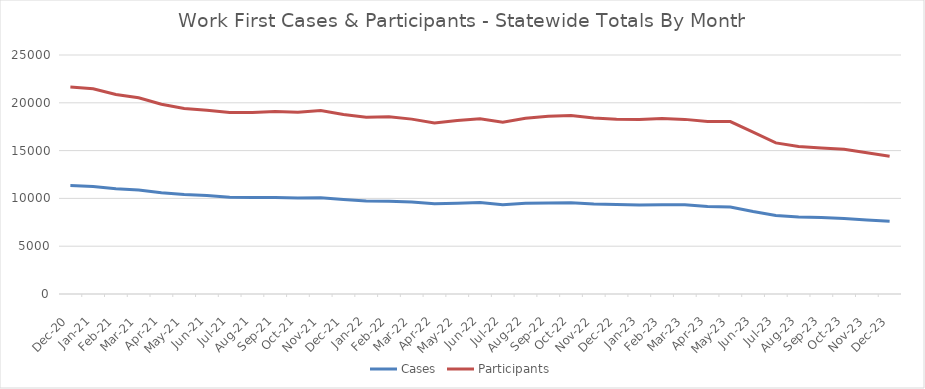
| Category | Cases | Participants |
|---|---|---|
| 2023-12-23 | 7598 | 14413 |
| 2023-11-23 | 7733 | 14770 |
| 2023-10-23 | 7909 | 15129 |
| 2023-09-23 | 7993 | 15261 |
| 2023-08-23 | 8048 | 15431 |
| 2023-07-23 | 8201 | 15804 |
| 2023-06-23 | 8626 | 16926 |
| 2023-05-23 | 9109 | 18037 |
| 2023-04-23 | 9158 | 18032 |
| 2023-03-23 | 9330 | 18266 |
| 2023-02-01 | 9348 | 18367 |
| 2023-01-01 | 9307 | 18258 |
| 2022-12-01 | 9357 | 18283 |
| 2022-11-22 | 9423 | 18412 |
| 2022-10-22 | 9547 | 18673 |
| 2022-09-22 | 9528 | 18586 |
| 2022-08-22 | 9505 | 18379 |
| 2022-07-22 | 9349 | 17973 |
| 2022-06-22 | 9561 | 18334 |
| 2022-05-22 | 9493 | 18139 |
| 2022-04-22 | 9434 | 17898 |
| 2022-03-22 | 9625 | 18293 |
| 2022-02-22 | 9713 | 18537 |
| 2022-01-22 | 9733 | 18484 |
| 2021-12-21 | 9885 | 18776 |
| 2021-11-21 | 10056 | 19192 |
| 2021-10-21 | 10034 | 19005 |
| 2021-09-21 | 10102 | 19085 |
| 2021-08-21 | 10090 | 18974 |
| 2021-07-21 | 10121 | 18988 |
| 2021-06-21 | 10298 | 19211 |
| 2021-05-21 | 10411 | 19413 |
| 2021-04-21 | 10601 | 19845 |
| 2021-03-21 | 10888 | 20521 |
| 2021-02-21 | 11007 | 20877 |
| 2021-01-21 | 11252 | 21466 |
| 2020-12-20 | 11350 | 21641 |